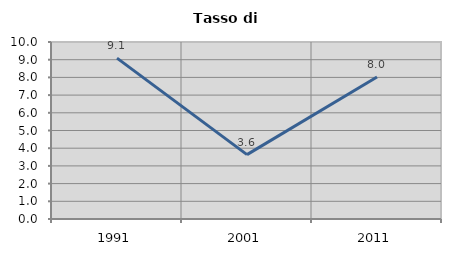
| Category | Tasso di disoccupazione   |
|---|---|
| 1991.0 | 9.091 |
| 2001.0 | 3.636 |
| 2011.0 | 8.021 |